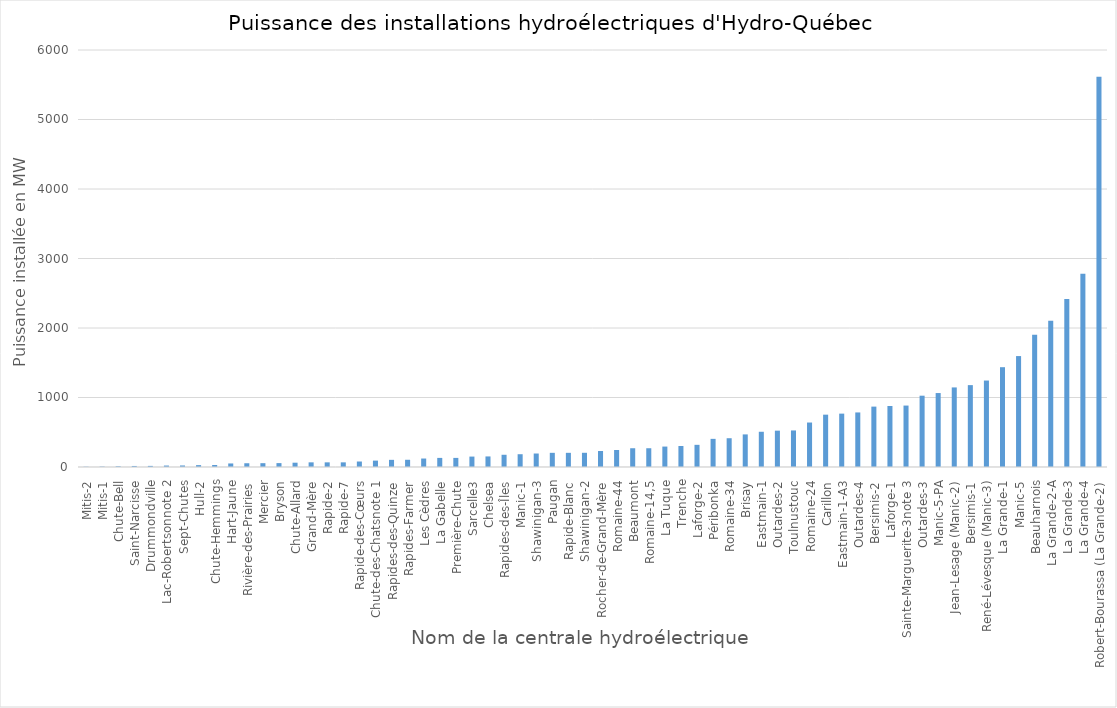
| Category | Series 0 | Puissance installée |
|---|---|---|
| Mitis-2 | 4 |  |
| Mitis-1 | 6 |  |
| Chute-Bell | 10 |  |
| Saint-Narcisse | 15 |  |
| Drummondville | 16 |  |
| Lac-Robertsonnote 2 | 21 |  |
| Sept-Chutes | 22 |  |
| Hull-2 | 27 |  |
| Chute-Hemmings | 29 |  |
| Hart-Jaune | 51 |  |
| Rivière-des-Prairies | 54 |  |
| Mercier | 55 |  |
| Bryson | 56 |  |
| Chute-Allard | 62 |  |
| Grand-Mère | 67 |  |
| Rapide-2 | 67 |  |
| Rapide-7 | 67 |  |
| Rapide-des-Cœurs | 79 |  |
| Chute-des-Chatsnote 1 | 92 |  |
| Rapides-des-Quinze | 103 |  |
| Rapides-Farmer | 104 |  |
| Les Cèdres | 122 |  |
| La Gabelle | 131 |  |
| Première-Chute | 131 |  |
| Sarcelle3 | 150 |  |
| Chelsea | 152 |  |
| Rapides-des-Îles | 176 |  |
| Manic-1 | 184 |  |
| Shawinigan-3 | 194 |  |
| Paugan | 204 |  |
| Rapide-Blanc | 204 |  |
| Shawinigan-2 | 204.5 |  |
| Rocher-de-Grand-Mère | 230 |  |
| Romaine-44 | 245 |  |
| Beaumont | 270 |  |
| Romaine-14,5 | 270 |  |
| La Tuque | 294 |  |
| Trenche | 302 |  |
| Laforge-2 | 319 |  |
| Péribonka | 405 |  |
| Romaine-34 | 414 |  |
| Brisay | 469 |  |
| Eastmain-1 | 507 |  |
| Outardes-2 | 523 |  |
| Toulnustouc | 526 |  |
| Romaine-24 | 640 |  |
| Carillon | 753 |  |
| Eastmain-1-A3 | 768 |  |
| Outardes-4 | 785 |  |
| Bersimis-2 | 869 |  |
| Laforge-1 | 878 |  |
| Sainte-Marguerite-3note 3 | 884 |  |
| Outardes-3 | 1026 |  |
| Manic-5-PA | 1064 |  |
| Jean-Lesage (Manic-2) | 1145 |  |
| Bersimis-1 | 1178 |  |
| René-Lévesque (Manic-3) | 1244 |  |
| La Grande-1 | 1436 |  |
| Manic-5 | 1596 |  |
| Beauharnois | 1903 |  |
| La Grande-2-A | 2106 |  |
| La Grande-3 | 2417 |  |
| La Grande-4 | 2779 |  |
| Robert-Bourassa (La Grande-2) | 5616 |  |